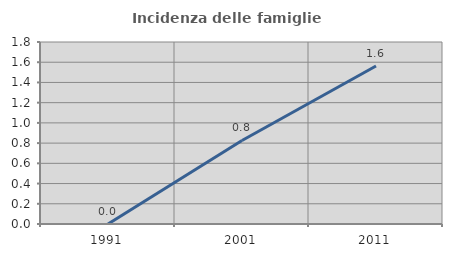
| Category | Incidenza delle famiglie numerose |
|---|---|
| 1991.0 | 0 |
| 2001.0 | 0.826 |
| 2011.0 | 1.562 |